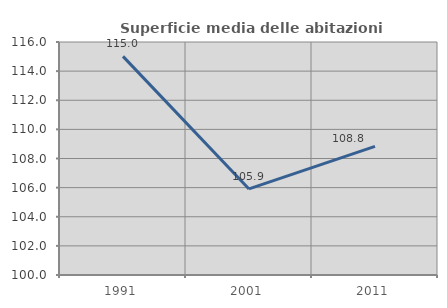
| Category | Superficie media delle abitazioni occupate |
|---|---|
| 1991.0 | 115.013 |
| 2001.0 | 105.909 |
| 2011.0 | 108.829 |